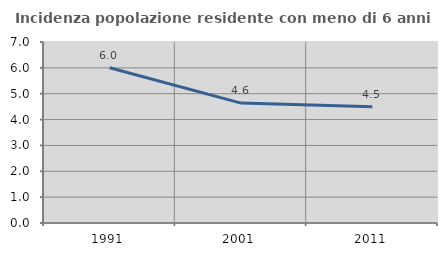
| Category | Incidenza popolazione residente con meno di 6 anni |
|---|---|
| 1991.0 | 6.002 |
| 2001.0 | 4.637 |
| 2011.0 | 4.5 |